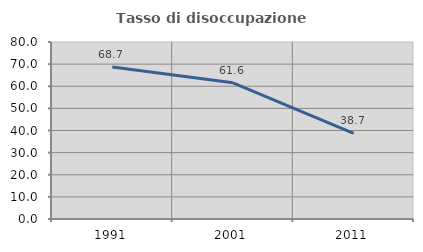
| Category | Tasso di disoccupazione giovanile  |
|---|---|
| 1991.0 | 68.709 |
| 2001.0 | 61.565 |
| 2011.0 | 38.66 |